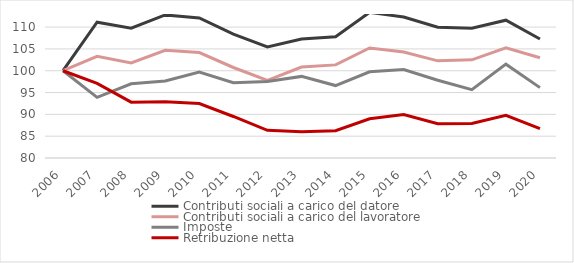
| Category | Contributi sociali a carico del datore  | Contributi sociali a carico del lavoratore  | Imposte  | Retribuzione netta |
|---|---|---|---|---|
| 2006.0 | 100 | 100 | 100 | 100 |
| 2007.0 | 111.13 | 103.284 | 93.891 | 97.099 |
| 2008.0 | 109.763 | 101.804 | 97 | 92.792 |
| 2009.0 | 112.783 | 104.672 | 97.633 | 92.875 |
| 2010.0 | 112.093 | 104.163 | 99.675 | 92.468 |
| 2011.0 | 108.396 | 100.74 | 97.27 | 89.516 |
| 2012.0 | 105.441 | 97.78 | 97.537 | 86.337 |
| 2013.0 | 107.277 | 100.833 | 98.702 | 86.002 |
| 2014.0 | 107.784 | 101.341 | 96.602 | 86.26 |
| 2015.0 | 113.382 | 105.227 | 99.752 | 88.975 |
| 2016.0 | 112.301 | 104.302 | 100.267 | 89.974 |
| 2017.0 | 109.984 | 102.266 | 97.824 | 87.872 |
| 2018.0 | 109.763 | 102.498 | 95.647 | 87.893 |
| 2019.0 | 111.586 | 105.273 | 101.508 | 89.784 |
| 2020.0 | 107.277 | 102.96 | 96.124 | 86.708 |